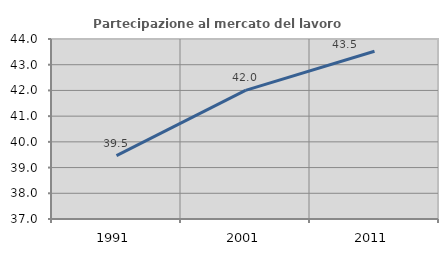
| Category | Partecipazione al mercato del lavoro  femminile |
|---|---|
| 1991.0 | 39.466 |
| 2001.0 | 42.004 |
| 2011.0 | 43.526 |